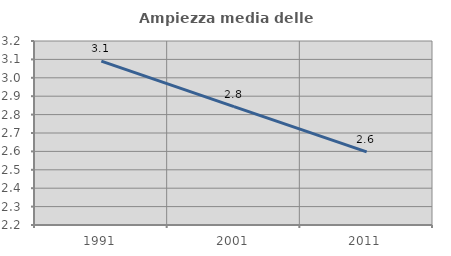
| Category | Ampiezza media delle famiglie |
|---|---|
| 1991.0 | 3.091 |
| 2001.0 | 2.843 |
| 2011.0 | 2.597 |